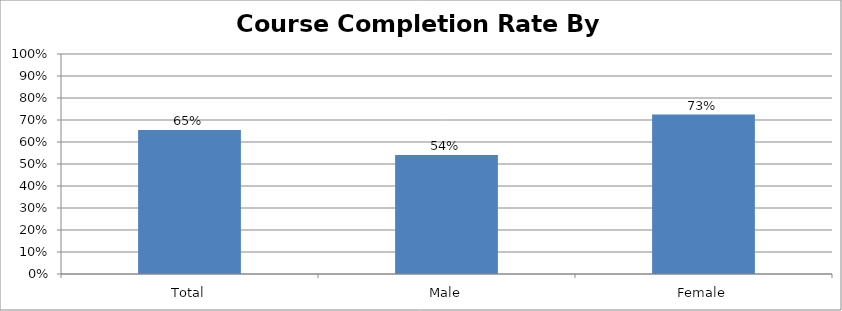
| Category | Course Completion By Gender |
|---|---|
| Total | 0.655 |
| Male | 0.541 |
| Female | 0.725 |